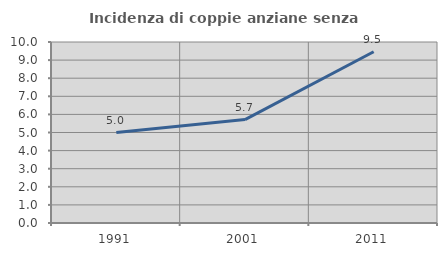
| Category | Incidenza di coppie anziane senza figli  |
|---|---|
| 1991.0 | 5 |
| 2001.0 | 5.714 |
| 2011.0 | 9.459 |